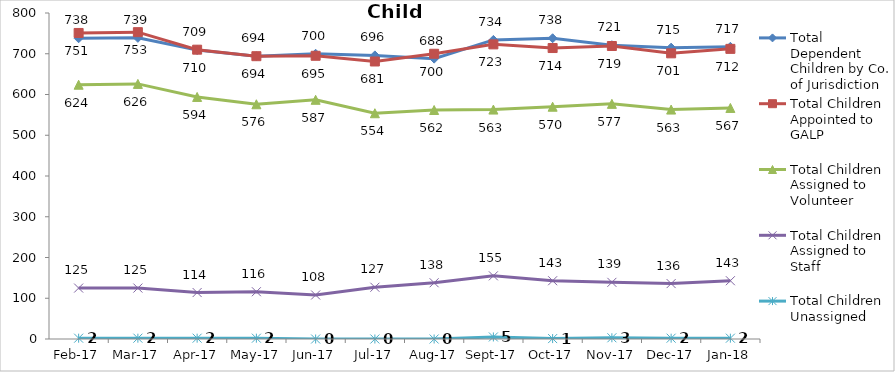
| Category | Total Dependent Children by Co. of Jurisdiction | Total Children Appointed to GALP | Total Children Assigned to Volunteer | Total Children Assigned to Staff | Total Children Unassigned |
|---|---|---|---|---|---|
| 2017-02-01 | 738 | 751 | 624 | 125 | 2 |
| 2017-03-01 | 739 | 753 | 626 | 125 | 2 |
| 2017-04-01 | 709 | 710 | 594 | 114 | 2 |
| 2017-05-01 | 694 | 694 | 576 | 116 | 2 |
| 2017-06-01 | 700 | 695 | 587 | 108 | 0 |
| 2017-07-01 | 696 | 681 | 554 | 127 | 0 |
| 2017-08-01 | 688 | 700 | 562 | 138 | 0 |
| 2017-09-01 | 734 | 723 | 563 | 155 | 5 |
| 2017-10-01 | 738 | 714 | 570 | 143 | 1 |
| 2017-11-01 | 721 | 719 | 577 | 139 | 3 |
| 2017-12-01 | 715 | 701 | 563 | 136 | 2 |
| 2018-01-01 | 717 | 712 | 567 | 143 | 2 |